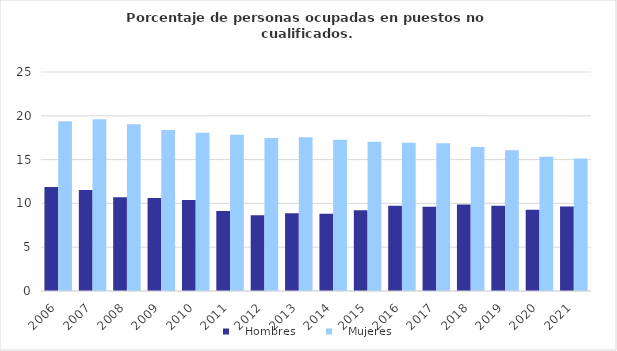
| Category |    Hombres |    Mujeres |
|---|---|---|
| 2006.0 | 11.862 | 19.379 |
| 2007.0 | 11.534 | 19.594 |
| 2008.0 | 10.695 | 19.024 |
| 2009.0 | 10.621 | 18.386 |
| 2010.0 | 10.387 | 18.075 |
| 2011.0 | 9.125 | 17.832 |
| 2012.0 | 8.648 | 17.458 |
| 2013.0 | 8.885 | 17.544 |
| 2014.0 | 8.829 | 17.269 |
| 2015.0 | 9.225 | 17.048 |
| 2016.0 | 9.742 | 16.932 |
| 2017.0 | 9.606 | 16.856 |
| 2018.0 | 9.861 | 16.433 |
| 2019.0 | 9.723 | 16.07 |
| 2020.0 | 9.274 | 15.336 |
| 2021.0 | 9.659 | 15.116 |